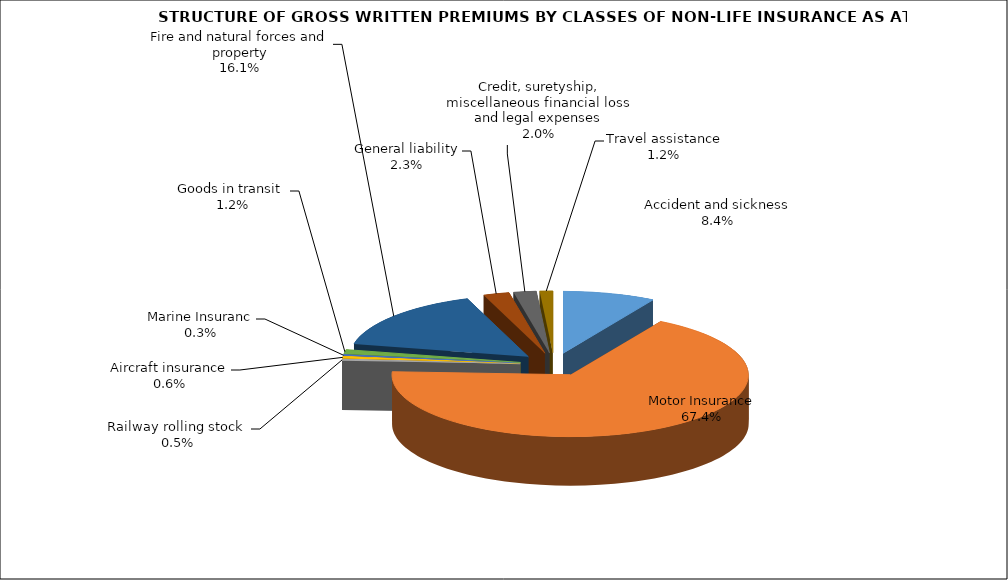
| Category | Accident and sickness |
|---|---|
| Accident and sickness | 0.084 |
| Motor Insurance | 0.674 |
| Railway rolling stock  | 0.005 |
| Aircraft insurance | 0.006 |
| Marine Insuranc | 0.003 |
| Goods in transit  | 0.012 |
| Fire and natural forces and property | 0.161 |
| General liability | 0.023 |
| Credit, suretyship, miscellaneous financial loss and legal expenses | 0.02 |
| Travel assistance | 0.012 |